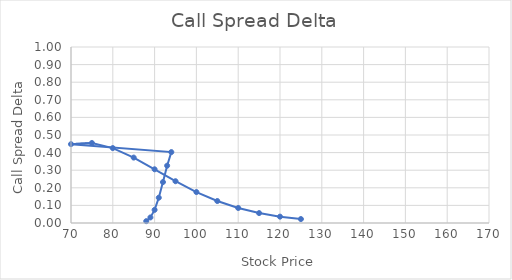
| Category | Call Spread Delta |
|---|---|
| 70.0 | 0.01 |
| 75.0 | 0.032 |
| 80.0 | 0.075 |
| 85.0 | 0.144 |
| 90.0 | 0.233 |
| 95.0 | 0.326 |
| 100.0 | 0.403 |
| 105.0 | 0.448 |
| 110.0 | 0.455 |
| 115.0 | 0.426 |
| 120.0 | 0.372 |
| 125.0 | 0.305 |
| 130.0 | 0.237 |
| 135.0 | 0.176 |
| 140.0 | 0.125 |
| 145.0 | 0.085 |
| 150.0 | 0.056 |
| 155.0 | 0.036 |
| 160.0 | 0.022 |